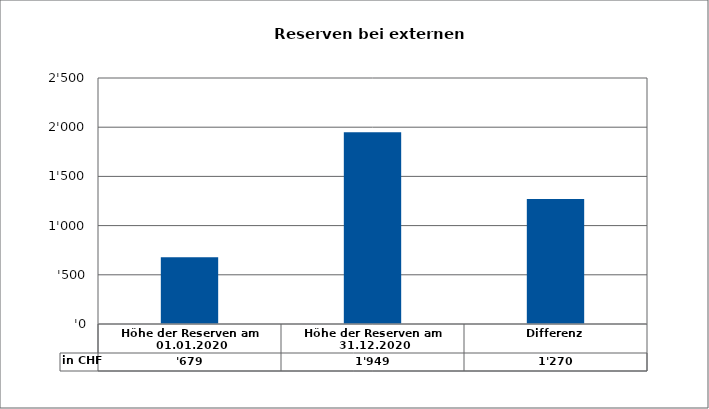
| Category | in CHF |
|---|---|
| Höhe der Reserven am 01.01.2020 | 679 |
| Höhe der Reserven am 31.12.2020 | 1949.25 |
| Differenz | 1270.25 |